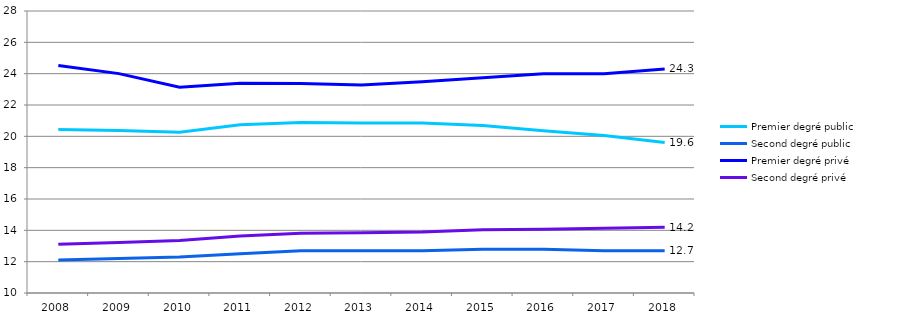
| Category | Premier degré public | Second degré public | Premier degré privé | Second degré privé |
|---|---|---|---|---|
| 2008.0 | 20.443 | 12.1 | 24.517 | 13.105 |
| 2009.0 | 20.377 | 12.2 | 24.003 | 13.227 |
| 2010.0 | 20.263 | 12.3 | 23.14 | 13.352 |
| 2011.0 | 20.743 | 12.5 | 23.382 | 13.635 |
| 2012.0 | 20.882 | 12.7 | 23.369 | 13.813 |
| 2013.0 | 20.844 | 12.7 | 23.284 | 13.841 |
| 2014.0 | 20.847 | 12.7 | 23.477 | 13.893 |
| 2015.0 | 20.687 | 12.8 | 23.741 | 14.035 |
| 2016.0 | 20.363 | 12.8 | 23.992 | 14.068 |
| 2017.0 | 20.053 | 12.7 | 23.994 | 14.14 |
| 2018.0 | 19.6 | 12.7 | 24.3 | 14.2 |